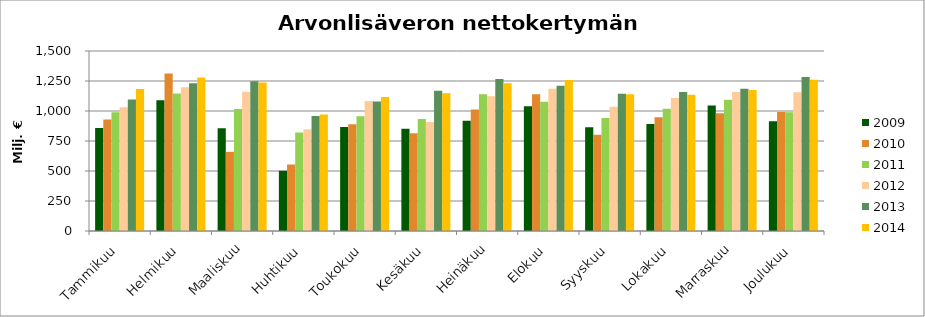
| Category | 2009 | 2010 | 2011 | 2012 | 2013 | 2014 |
|---|---|---|---|---|---|---|
| Tammikuu | 858.934 | 929.369 | 989.979 | 1030.641 | 1096.075 | 1182.963 |
| Helmikuu | 1089.664 | 1313.151 | 1145.438 | 1198.153 | 1230.33 | 1280.053 |
| Maaliskuu | 856.122 | 659.776 | 1016.463 | 1160.067 | 1247.422 | 1238.066 |
| Huhtikuu | 501.743 | 554.255 | 821.506 | 848.926 | 959.001 | 971.376 |
| Toukokuu | 867.163 | 889.769 | 955.963 | 1083.741 | 1078.37 | 1117.331 |
| Kesäkuu | 851.056 | 814.024 | 933.418 | 909.246 | 1168.206 | 1148.519 |
| Heinäkuu | 918.059 | 1013.537 | 1139.789 | 1122.196 | 1267.424 | 1230.372 |
| Elokuu | 1040.537 | 1139.703 | 1077.137 | 1184.622 | 1210.636 | 1257.861 |
| Syyskuu | 863.546 | 801.068 | 941.737 | 1035.954 | 1142.819 | 1138.821 |
| Lokakuu | 892.063 | 947.674 | 1018.067 | 1107.374 | 1157.981 | 1134.703 |
| Marraskuu | 1046.386 | 981.431 | 1094.661 | 1159.214 | 1185.544 | 1175.504 |
| Joulukuu | 914.348 | 991.049 | 989.325 | 1156.453 | 1284.095 | 1259.612 |